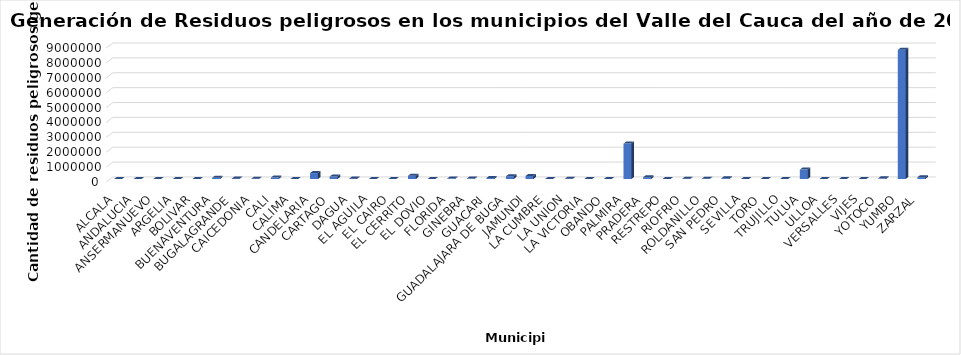
| Category | Series 0 |
|---|---|
| ALCALA | 3068 |
| ANDALUCIA | 5174.5 |
| ANSERMANUEVO | 1791 |
| ARGELIA | 694.8 |
| BOLIVAR | 2655.25 |
| BUENAVENTURA | 79131.7 |
| BUGALAGRANDE | 25941.13 |
| CAICEDONIA | 15781.39 |
| CALI | 96892 |
| CALIMA | 6106 |
| CANDELARIA | 399282.55 |
| CARTAGO | 166249.26 |
| DAGUA | 25648.75 |
| EL AGUILA | 856.6 |
| EL CAIRO | 1019 |
| EL CERRITO | 217043.73 |
| EL DOVIO | 2022 |
| FLORIDA | 34749.8 |
| GINEBRA | 31045.3 |
| GUACARI | 65982.5 |
| GUADALAJARA DE BUGA | 185376.55 |
| JAMUNDI | 203708.68 |
| LA CUMBRE | 2868 |
| LA UNION | 16580 |
| LA VICTORIA | 3162.5 |
| OBANDO | 4549.3 |
| PALMIRA | 2382628.69 |
| PRADERA | 119515.9 |
| RESTREPO | 7214.3 |
| RIOFRIO | 20218.6 |
| ROLDANILLO | 21270.3 |
| SAN PEDRO | 54271.66 |
| SEVILLA | 2716.04 |
| TORO | 2309.1 |
| TRUJILLO | 5345.45 |
| TULUA | 631766.44 |
| ULLOA | 563 |
| VERSALLES | 1609.4 |
| VIJES | 2260.02 |
| YOTOCO | 45405.6 |
| YUMBO | 8679154.36 |
| ZARZAL | 119933.39 |